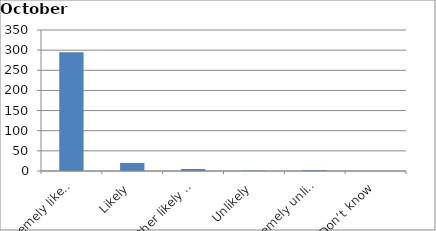
| Category | Series 0 |
|---|---|
| Extremely likely | 295 |
| Likely | 20 |
| Neither likely nor unlikely | 5 |
| Unlikely | 1 |
| Extremely unlikely | 2 |
| Don’t know | 0 |